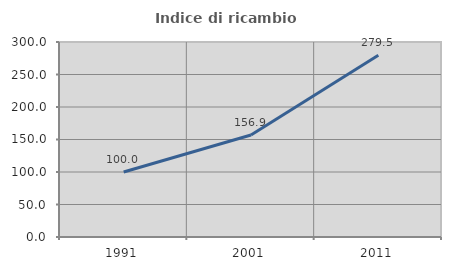
| Category | Indice di ricambio occupazionale  |
|---|---|
| 1991.0 | 100 |
| 2001.0 | 156.911 |
| 2011.0 | 279.545 |